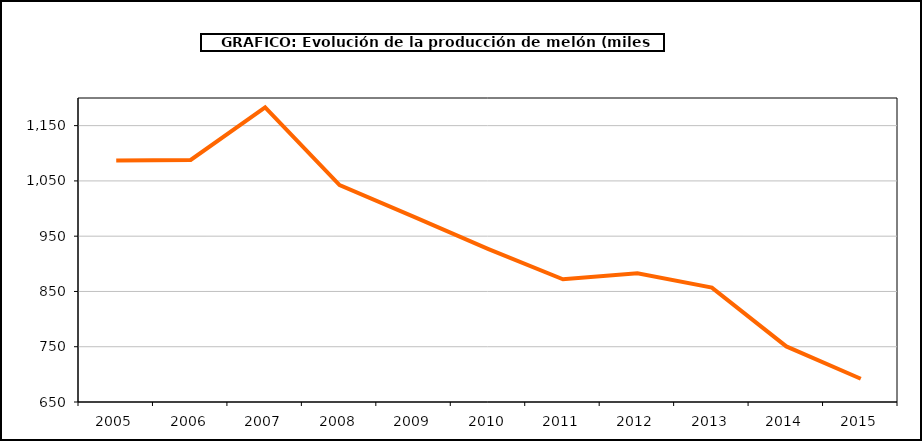
| Category | producción |
|---|---|
| 2005.0 | 1086.718 |
| 2006.0 | 1087.917 |
| 2007.0 | 1183.154 |
| 2008.0 | 1042.439 |
| 2009.0 | 984.786 |
| 2010.0 | 926.693 |
| 2011.0 | 871.996 |
| 2012.0 | 882.869 |
| 2013.0 | 856.951 |
| 2014.0 | 750.592 |
| 2015.0 | 692.056 |